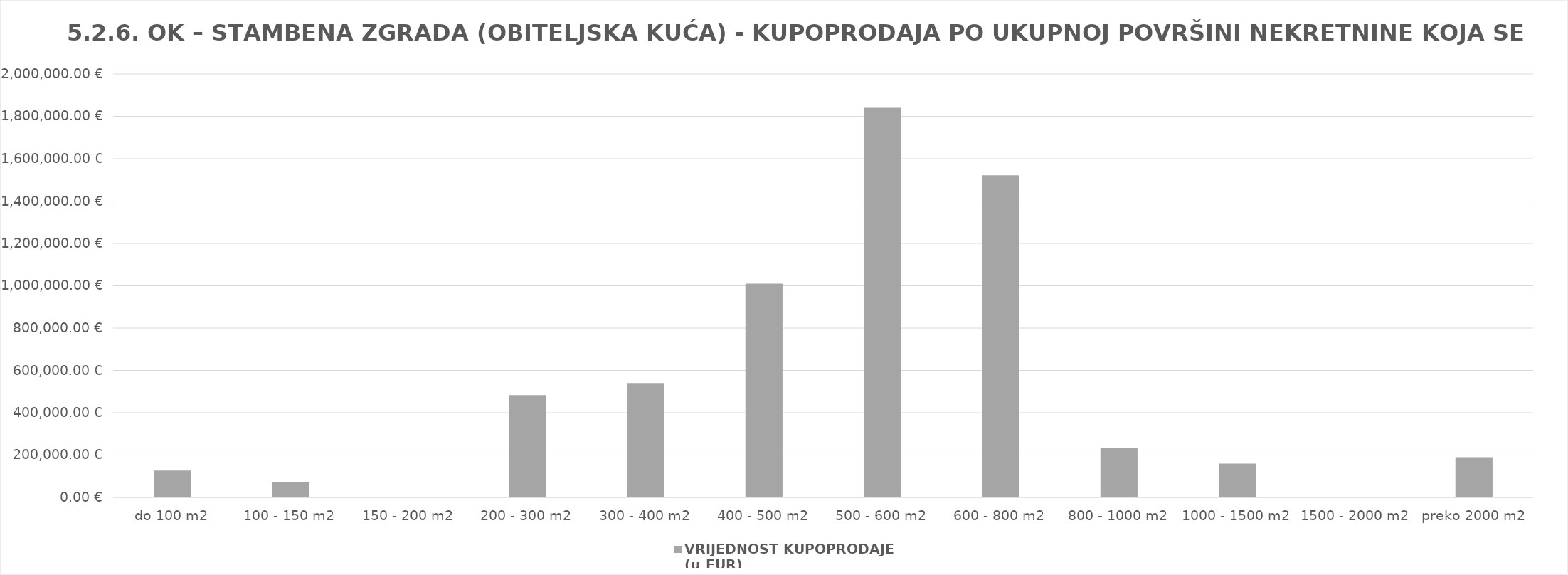
| Category | VRIJEDNOST KUPOPRODAJE   
(u EUR) |
|---|---|
| do 100 m2 | 127000 |
| 100 - 150 m2 | 70300 |
| 150 - 200 m2 | 0 |
| 200 - 300 m2 | 483000 |
| 300 - 400 m2 | 540000 |
| 400 - 500 m2 | 1010000 |
| 500 - 600 m2 | 1840000 |
| 600 - 800 m2 | 1522100 |
| 800 - 1000 m2 | 233000 |
| 1000 - 1500 m2 | 160000 |
| 1500 - 2000 m2 | 0 |
| preko 2000 m2 | 190000 |